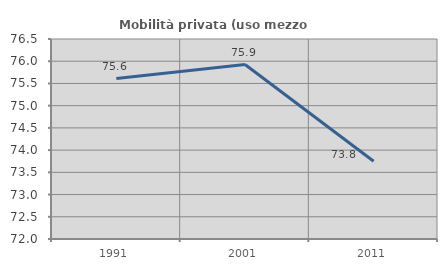
| Category | Mobilità privata (uso mezzo privato) |
|---|---|
| 1991.0 | 75.61 |
| 2001.0 | 75.926 |
| 2011.0 | 73.75 |